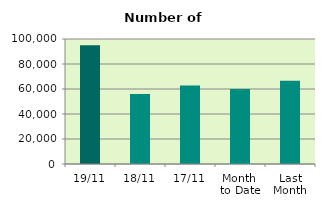
| Category | Series 0 |
|---|---|
| 19/11 | 94970 |
| 18/11 | 56086 |
| 17/11 | 62870 |
| Month 
to Date | 60096.667 |
| Last
Month | 66688.857 |